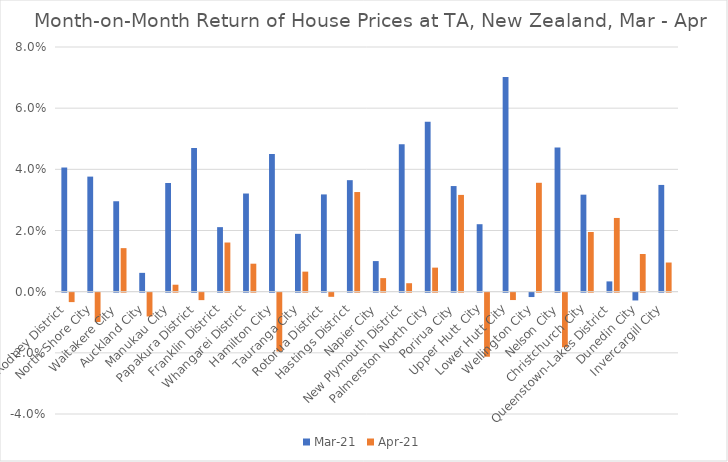
| Category | Mar-21 | Apr-21 |
|---|---|---|
| Rodney District | 0.041 | -0.003 |
| North Shore City | 0.038 | -0.01 |
| Waitakere City | 0.03 | 0.014 |
| Auckland City | 0.006 | -0.008 |
| Manukau City | 0.036 | 0.002 |
| Papakura District | 0.047 | -0.002 |
| Franklin District | 0.021 | 0.016 |
| Whangarei District | 0.032 | 0.009 |
| Hamilton City | 0.045 | -0.019 |
| Tauranga City | 0.019 | 0.007 |
| Rotorua District | 0.032 | -0.001 |
| Hastings District | 0.036 | 0.033 |
| Napier City | 0.01 | 0.004 |
| New Plymouth District | 0.048 | 0.003 |
| Palmerston North City | 0.056 | 0.008 |
| Porirua City | 0.035 | 0.032 |
| Upper Hutt City | 0.022 | -0.021 |
| Lower Hutt City | 0.07 | -0.002 |
| Wellington City | -0.001 | 0.036 |
| Nelson City | 0.047 | -0.018 |
| Christchurch City | 0.032 | 0.02 |
| Queenstown-Lakes District | 0.003 | 0.024 |
| Dunedin City | -0.003 | 0.012 |
| Invercargill City | 0.035 | 0.01 |